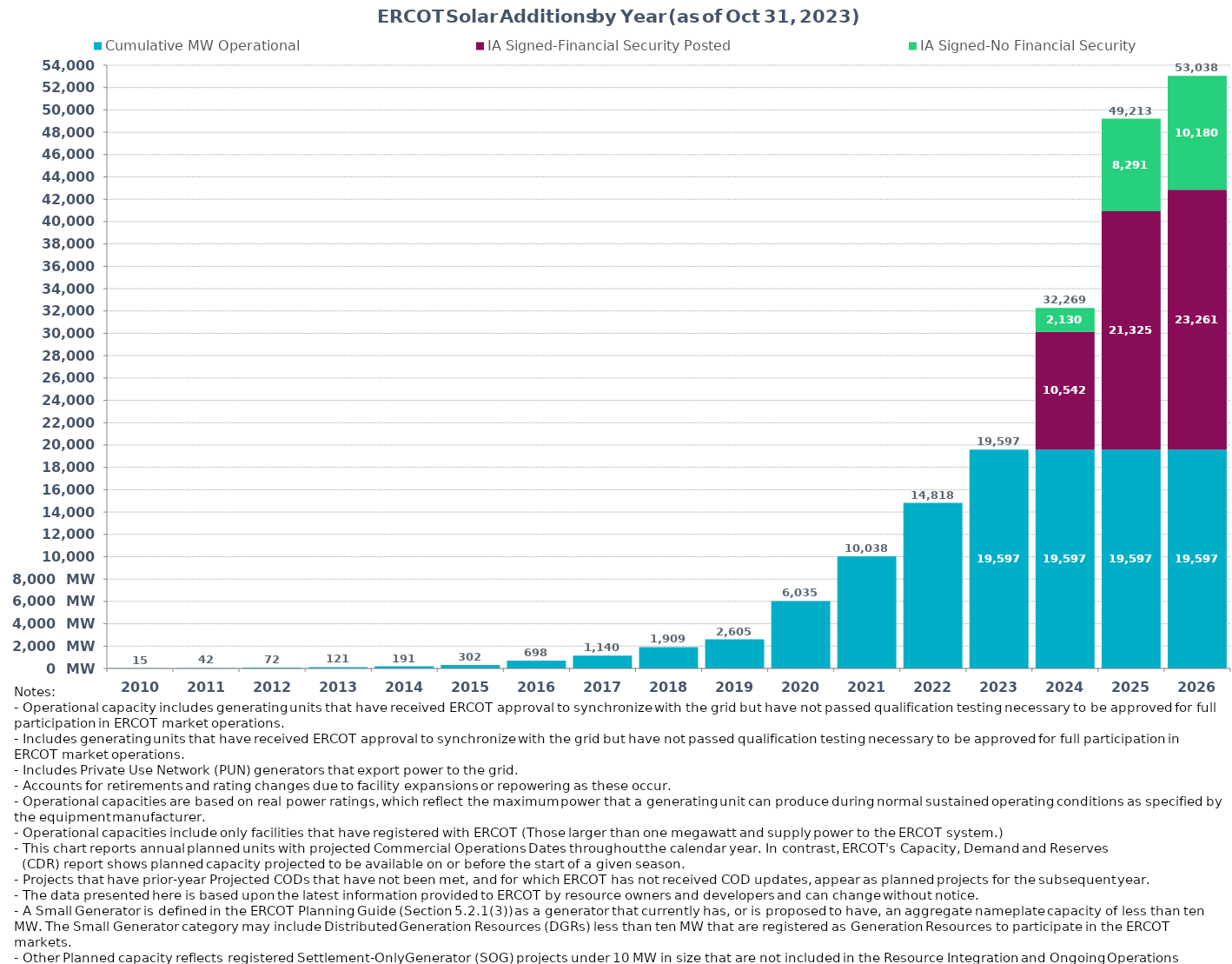
| Category | Cumulative MW Operational | IA Signed-Financial Security Posted  | IA Signed-No Financial Security  | Other Planned | Cumulative Installed and Planned |
|---|---|---|---|---|---|
| 2010.0 | 14.9 | 0 | 0 | 0 | 14.9 |
| 2011.0 | 41.6 | 0 | 0 | 0 | 41.6 |
| 2012.0 | 72 | 0 | 0 | 0 | 72 |
| 2013.0 | 121.18 | 0 | 0 | 0 | 121.18 |
| 2014.0 | 190.7 | 0 | 0 | 0 | 190.7 |
| 2015.0 | 301.71 | 0 | 0 | 0 | 301.71 |
| 2016.0 | 698.22 | 0 | 0 | 0 | 698.22 |
| 2017.0 | 1140.12 | 0 | 0 | 0 | 1140.12 |
| 2018.0 | 1909.16 | 0 | 0 | 0 | 1909.16 |
| 2019.0 | 2605.35 | 0 | 0 | 0 | 2605.35 |
| 2020.0 | 6034.64 | 0 | 0 | 0 | 6034.64 |
| 2021.0 | 10038.12 | 0 | 0 | 0 | 10038.12 |
| 2022.0 | 14818.22 | 0 | 0 | 0 | 14818.22 |
| 2023.0 | 19597.36 | 0 | 0 | 0 | 19597.36 |
| 2024.0 | 19597.36 | 10541.58 | 2130.3 | 0 | 32269.24 |
| 2025.0 | 19597.36 | 21324.91 | 8290.79 | 0 | 49213.06 |
| 2026.0 | 19597.36 | 23261 | 10180.08 | 0 | 53038.44 |